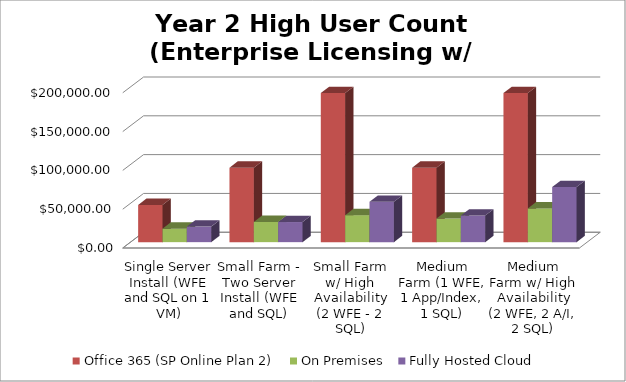
| Category | Office 365 (SP Online Plan 2)  | On Premises  | Fully Hosted Cloud    |
|---|---|---|---|
| Single Server Install (WFE and SQL on 1 VM) | 48000 | 17390.604 | 20040 |
| Small Farm - Two Server Install (WFE and SQL) | 96000 | 26085.906 | 25920 |
| Small Farm w/ High Availability (2 WFE - 2 SQL) | 192000 | 34781.208 | 51900 |
| Medium Farm (1 WFE, 1 App/Index, 1 SQL) | 96000 | 30433.557 | 34320 |
| Medium Farm w/ High Availability (2 WFE, 2 A/I, 2 SQL) | 192000 | 43476.51 | 70980 |